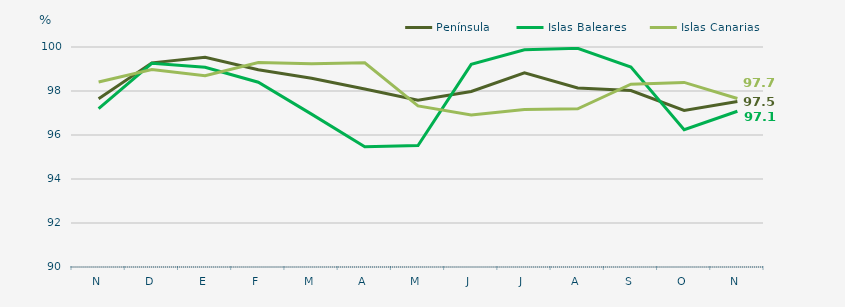
| Category | Península | Islas Baleares | Islas Canarias |
|---|---|---|---|
| N | 97.65 | 97.2 | 98.41 |
| D | 99.28 | 99.26 | 98.98 |
| E | 99.53 | 99.08 | 98.69 |
| F | 98.97 | 98.4 | 99.29 |
| M | 98.58 | 96.95 | 99.24 |
| A | 98.09 | 95.47 | 99.28 |
| M | 97.58 | 95.52 | 97.32 |
| J | 97.98 | 99.21 | 96.91 |
| J | 98.83 | 99.87 | 97.16 |
| A | 98.14 | 99.94 | 97.19 |
| S | 98.02 | 99.09 | 98.31 |
| O | 97.12 | 96.24 | 98.39 |
| N | 97.52 | 97.08 | 97.66 |